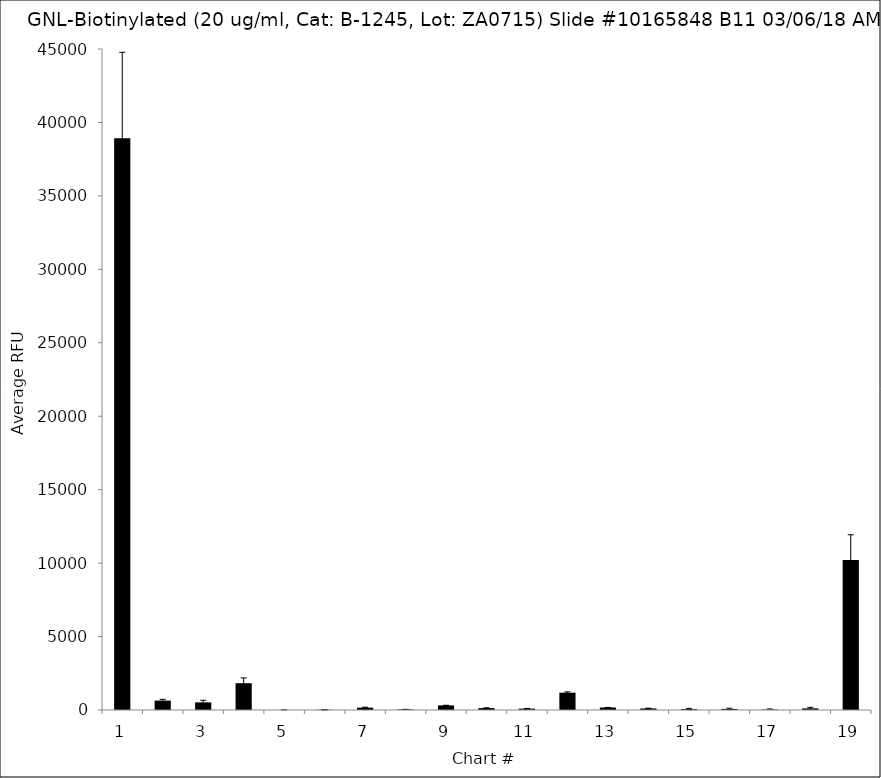
| Category | Series 0 |
|---|---|
| 1.0 | 38922.5 |
| 2.0 | 639.75 |
| 3.0 | 520 |
| 4.0 | 1825.75 |
| 5.0 | 1.25 |
| 6.0 | 17.75 |
| 7.0 | 158.5 |
| 8.0 | 38 |
| 9.0 | 312.25 |
| 10.0 | 128.75 |
| 11.0 | 92.75 |
| 12.0 | 1178.5 |
| 13.0 | 170 |
| 14.0 | 105.75 |
| 15.0 | 65.75 |
| 16.0 | 74.75 |
| 17.0 | 31 |
| 18.0 | 109.75 |
| 19.0 | 10204.75 |